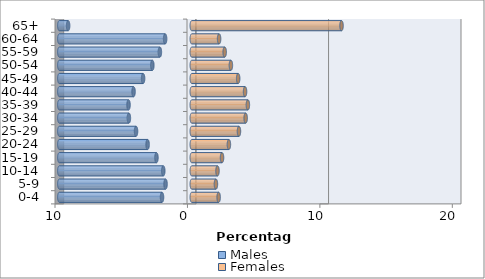
| Category | Males | Females |
|---|---|---|
| 0-4 | -2.247 | 2.028 |
| 5-9 | -1.981 | 1.823 |
| 10-14 | -2.152 | 1.941 |
| 15-19 | -2.668 | 2.284 |
| 20-24 | -3.336 | 2.802 |
| 25-29 | -4.209 | 3.562 |
| 30-34 | -4.749 | 4.068 |
| 35-39 | -4.776 | 4.236 |
| 40-44 | -4.397 | 4.022 |
| 45-49 | -3.676 | 3.503 |
| 50-54 | -2.978 | 2.953 |
| 55-59 | -2.409 | 2.484 |
| 60-64 | -2.013 | 2.062 |
| 65+ | -9.337 | 11.307 |